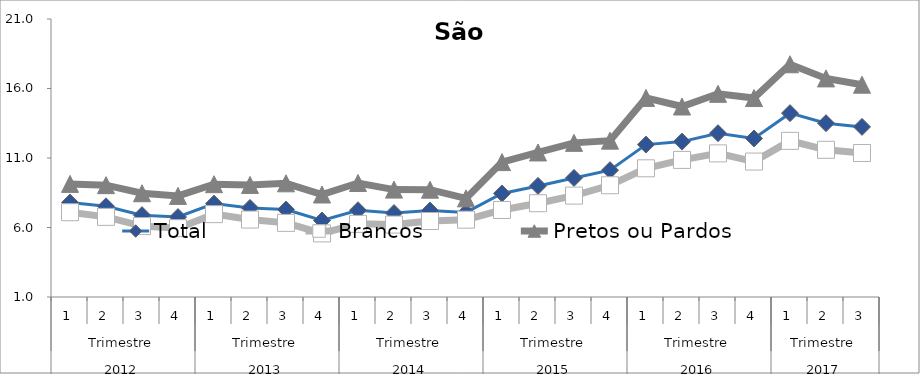
| Category | Total | Brancos | Pretos ou Pardos |
|---|---|---|---|
| 0 | 7.792 | 7.099 | 9.138 |
| 1 | 7.524 | 6.766 | 9.047 |
| 2 | 6.889 | 6.102 | 8.465 |
| 3 | 6.754 | 5.954 | 8.274 |
| 4 | 7.718 | 6.96 | 9.117 |
| 5 | 7.405 | 6.572 | 9.063 |
| 6 | 7.289 | 6.333 | 9.178 |
| 7 | 6.504 | 5.576 | 8.373 |
| 8 | 7.239 | 6.261 | 9.203 |
| 9 | 7.039 | 6.211 | 8.725 |
| 10 | 7.217 | 6.467 | 8.719 |
| 11 | 7.085 | 6.563 | 8.096 |
| 12 | 8.45 | 7.262 | 10.704 |
| 13 | 8.992 | 7.747 | 11.399 |
| 14 | 9.566 | 8.296 | 12.089 |
| 15 | 10.122 | 9.04 | 12.249 |
| 16 | 11.964 | 10.258 | 15.321 |
| 17 | 12.179 | 10.862 | 14.704 |
| 18 | 12.781 | 11.334 | 15.618 |
| 19 | 12.406 | 10.745 | 15.313 |
| 20 | 14.226 | 12.234 | 17.744 |
| 21 | 13.504 | 11.589 | 16.727 |
| 22 | 13.239 | 11.36 | 16.273 |